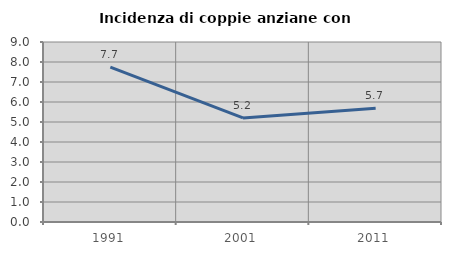
| Category | Incidenza di coppie anziane con figli |
|---|---|
| 1991.0 | 7.746 |
| 2001.0 | 5.201 |
| 2011.0 | 5.687 |